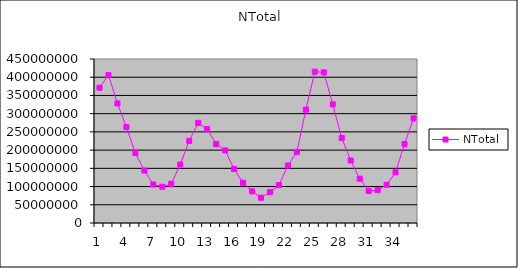
| Category | NTotal |
|---|---|
| 0 | 371157476.458 |
| 1 | 405870772.65 |
| 2 | 328011525.205 |
| 3 | 263211305.025 |
| 4 | 191996850.323 |
| 5 | 144062726.625 |
| 6 | 105647804.04 |
| 7 | 99431287.46 |
| 8 | 107587498.986 |
| 9 | 160681539.616 |
| 10 | 225382956.001 |
| 11 | 274832633.191 |
| 12 | 257770627.179 |
| 13 | 217058695.61 |
| 14 | 199211154.251 |
| 15 | 148131321.688 |
| 16 | 110386564.283 |
| 17 | 86756581.326 |
| 18 | 69343428.822 |
| 19 | 85145091.103 |
| 20 | 103964053.679 |
| 21 | 157847934.059 |
| 22 | 195082999.434 |
| 23 | 310910902.712 |
| 24 | 415154313.233 |
| 25 | 413329879.295 |
| 26 | 325498836.993 |
| 27 | 233369778.428 |
| 28 | 171483948.852 |
| 29 | 121637516.994 |
| 30 | 87931429.049 |
| 31 | 90104951.523 |
| 32 | 104746676.21 |
| 33 | 139313966.855 |
| 34 | 216859790.084 |
| 35 | 287426983.132 |